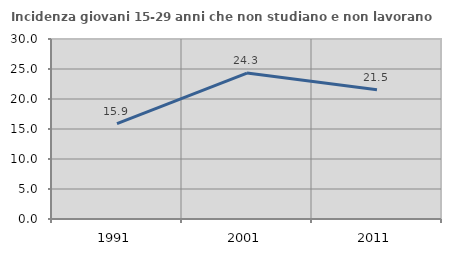
| Category | Incidenza giovani 15-29 anni che non studiano e non lavorano  |
|---|---|
| 1991.0 | 15.879 |
| 2001.0 | 24.325 |
| 2011.0 | 21.536 |